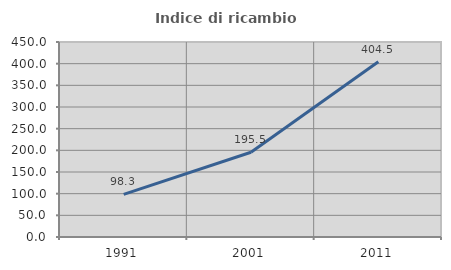
| Category | Indice di ricambio occupazionale  |
|---|---|
| 1991.0 | 98.311 |
| 2001.0 | 195.522 |
| 2011.0 | 404.455 |